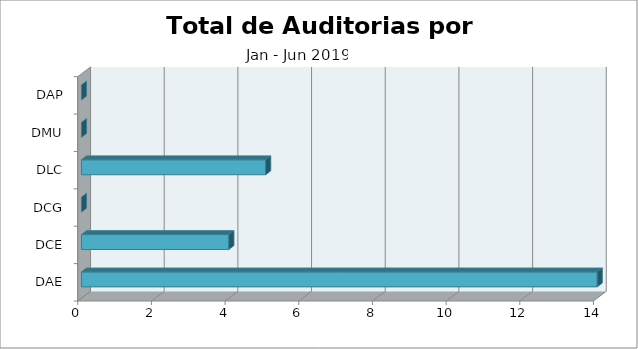
| Category | TOTAL |
|---|---|
| DAE | 14 |
| DCE | 4 |
| DCG | 0 |
| DLC | 5 |
| DMU | 0 |
| DAP | 0 |